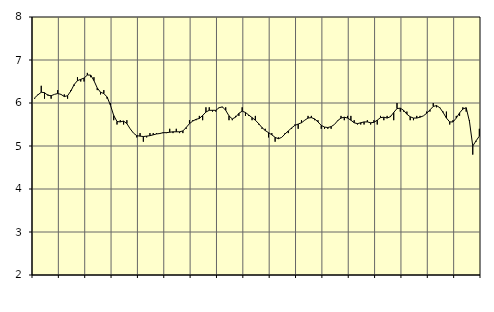
| Category | Piggar | Transport, SNI 49-53 |
|---|---|---|
| nan | 6.1 | 6.12 |
| 87.0 | 6.2 | 6.19 |
| 87.0 | 6.4 | 6.25 |
| 87.0 | 6.1 | 6.24 |
| nan | 6.2 | 6.18 |
| 88.0 | 6.1 | 6.17 |
| 88.0 | 6.2 | 6.2 |
| 88.0 | 6.3 | 6.22 |
| nan | 6.2 | 6.2 |
| 89.0 | 6.2 | 6.15 |
| 89.0 | 6.1 | 6.17 |
| 89.0 | 6.3 | 6.28 |
| nan | 6.4 | 6.43 |
| 90.0 | 6.6 | 6.52 |
| 90.0 | 6.5 | 6.55 |
| 90.0 | 6.5 | 6.58 |
| nan | 6.7 | 6.65 |
| 91.0 | 6.6 | 6.65 |
| 91.0 | 6.6 | 6.52 |
| 91.0 | 6.3 | 6.35 |
| nan | 6.2 | 6.25 |
| 92.0 | 6.3 | 6.22 |
| 92.0 | 6.1 | 6.14 |
| 92.0 | 6 | 5.95 |
| nan | 5.6 | 5.71 |
| 93.0 | 5.5 | 5.57 |
| 93.0 | 5.6 | 5.56 |
| 93.0 | 5.5 | 5.58 |
| nan | 5.6 | 5.52 |
| 94.0 | 5.4 | 5.4 |
| 94.0 | 5.3 | 5.3 |
| 94.0 | 5.2 | 5.24 |
| nan | 5.3 | 5.23 |
| 95.0 | 5.1 | 5.22 |
| 95.0 | 5.2 | 5.23 |
| 95.0 | 5.3 | 5.24 |
| nan | 5.3 | 5.26 |
| 96.0 | 5.3 | 5.28 |
| 96.0 | 5.3 | 5.29 |
| 96.0 | 5.3 | 5.31 |
| nan | 5.3 | 5.31 |
| 97.0 | 5.4 | 5.32 |
| 97.0 | 5.3 | 5.33 |
| 97.0 | 5.4 | 5.33 |
| nan | 5.3 | 5.33 |
| 98.0 | 5.3 | 5.35 |
| 98.0 | 5.4 | 5.43 |
| 98.0 | 5.6 | 5.52 |
| nan | 5.6 | 5.58 |
| 99.0 | 5.6 | 5.62 |
| 99.0 | 5.7 | 5.64 |
| 99.0 | 5.6 | 5.71 |
| nan | 5.9 | 5.79 |
| 0.0 | 5.9 | 5.83 |
| 0.0 | 5.8 | 5.83 |
| 0.0 | 5.8 | 5.83 |
| nan | 5.9 | 5.89 |
| 1.0 | 5.9 | 5.91 |
| 1.0 | 5.9 | 5.83 |
| 1.0 | 5.6 | 5.7 |
| nan | 5.6 | 5.63 |
| 2.0 | 5.7 | 5.67 |
| 2.0 | 5.7 | 5.76 |
| 2.0 | 5.9 | 5.81 |
| nan | 5.7 | 5.78 |
| 3.0 | 5.7 | 5.72 |
| 3.0 | 5.6 | 5.66 |
| 3.0 | 5.7 | 5.6 |
| nan | 5.5 | 5.52 |
| 4.0 | 5.4 | 5.43 |
| 4.0 | 5.4 | 5.36 |
| 4.0 | 5.2 | 5.31 |
| nan | 5.3 | 5.26 |
| 5.0 | 5.1 | 5.2 |
| 5.0 | 5.2 | 5.17 |
| 5.0 | 5.2 | 5.2 |
| nan | 5.3 | 5.28 |
| 6.0 | 5.3 | 5.35 |
| 6.0 | 5.4 | 5.42 |
| 6.0 | 5.5 | 5.48 |
| nan | 5.4 | 5.51 |
| 7.0 | 5.6 | 5.54 |
| 7.0 | 5.6 | 5.6 |
| 7.0 | 5.7 | 5.65 |
| nan | 5.7 | 5.66 |
| 8.0 | 5.6 | 5.63 |
| 8.0 | 5.6 | 5.56 |
| 8.0 | 5.4 | 5.48 |
| nan | 5.4 | 5.44 |
| 9.0 | 5.4 | 5.43 |
| 9.0 | 5.4 | 5.45 |
| 9.0 | 5.5 | 5.5 |
| nan | 5.6 | 5.59 |
| 10.0 | 5.7 | 5.65 |
| 10.0 | 5.6 | 5.67 |
| 10.0 | 5.7 | 5.65 |
| nan | 5.7 | 5.6 |
| 11.0 | 5.6 | 5.54 |
| 11.0 | 5.5 | 5.52 |
| 11.0 | 5.5 | 5.54 |
| nan | 5.5 | 5.56 |
| 12.0 | 5.6 | 5.56 |
| 12.0 | 5.5 | 5.54 |
| 12.0 | 5.6 | 5.55 |
| nan | 5.5 | 5.6 |
| 13.0 | 5.7 | 5.66 |
| 13.0 | 5.6 | 5.67 |
| 13.0 | 5.7 | 5.65 |
| nan | 5.7 | 5.68 |
| 14.0 | 5.6 | 5.78 |
| 14.0 | 6 | 5.87 |
| 14.0 | 5.8 | 5.88 |
| nan | 5.8 | 5.83 |
| 15.0 | 5.8 | 5.74 |
| 15.0 | 5.6 | 5.68 |
| 15.0 | 5.6 | 5.65 |
| nan | 5.7 | 5.65 |
| 16.0 | 5.7 | 5.67 |
| 16.0 | 5.7 | 5.7 |
| 16.0 | 5.8 | 5.76 |
| nan | 5.8 | 5.84 |
| 17.0 | 6 | 5.92 |
| 17.0 | 5.9 | 5.94 |
| 17.0 | 5.9 | 5.89 |
| nan | 5.8 | 5.78 |
| 18.0 | 5.8 | 5.65 |
| 18.0 | 5.5 | 5.56 |
| 18.0 | 5.6 | 5.56 |
| nan | 5.7 | 5.65 |
| 19.0 | 5.7 | 5.77 |
| 19.0 | 5.9 | 5.86 |
| 19.0 | 5.8 | 5.89 |
| nan | 5.6 | 5.57 |
| 20.0 | 4.8 | 5 |
| 20.0 | 5.1 | 5.12 |
| 20.0 | 5.4 | 5.23 |